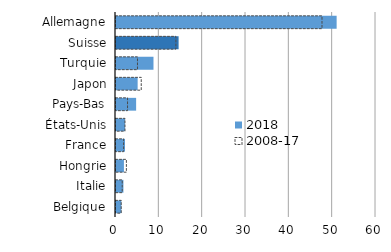
| Category | 2018 | 2008-17 |
|---|---|---|
| Allemagne | 50.917 | 47.538 |
| Suisse | 14.448 | 13.819 |
| Turquie | 8.651 | 4.956 |
| Japon | 4.995 | 5.824 |
| Pays-Bas | 4.646 | 2.661 |
| États-Unis | 2.089 | 2.069 |
| France | 2.073 | 1.755 |
| Hongrie | 1.828 | 2.397 |
| Italie | 1.714 | 1.432 |
| Belgique | 1.229 | 1.201 |